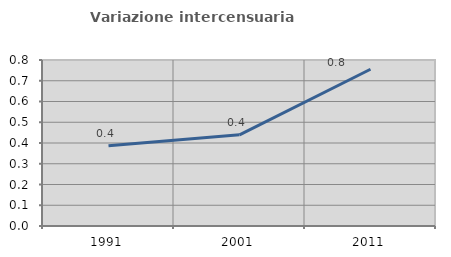
| Category | Variazione intercensuaria annua |
|---|---|
| 1991.0 | 0.387 |
| 2001.0 | 0.439 |
| 2011.0 | 0.755 |